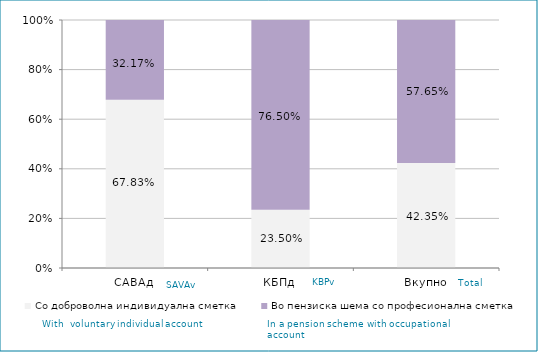
| Category | Со доброволна индивидуална сметка  | Во пензиска шема со професионална сметка |
|---|---|---|
| САВАд | 0.678 | 0.322 |
| КБПд | 0.235 | 0.765 |
| Вкупно | 0.424 | 0.576 |